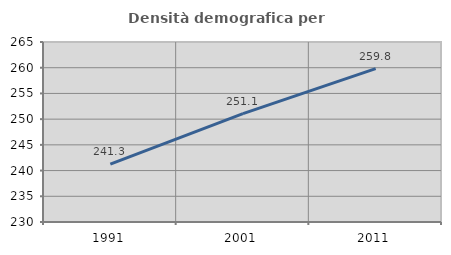
| Category | Densità demografica |
|---|---|
| 1991.0 | 241.252 |
| 2001.0 | 251.071 |
| 2011.0 | 259.835 |